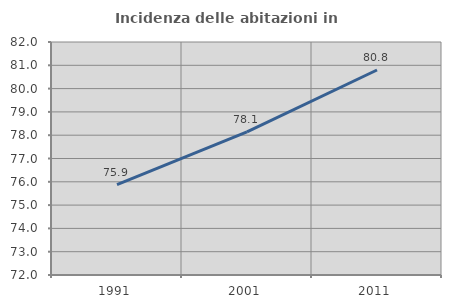
| Category | Incidenza delle abitazioni in proprietà  |
|---|---|
| 1991.0 | 75.882 |
| 2001.0 | 78.142 |
| 2011.0 | 80.798 |